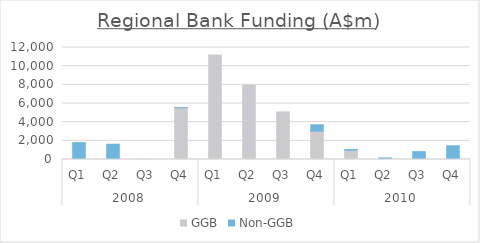
| Category | GGB | Non-GGB |
|---|---|---|
| 0 | 0 | 1810.315 |
| 1 | 0 | 1633.882 |
| 2 | 0 | 10.654 |
| 3 | 5553.286 | 2.613 |
| 4 | 11204.329 | 0 |
| 5 | 7943.383 | 0 |
| 6 | 5101.573 | 0 |
| 7 | 3032.495 | 690.19 |
| 8 | 1000 | 62 |
| 9 | 0 | 171 |
| 10 | 0 | 839.45 |
| 11 | 0 | 1468.236 |